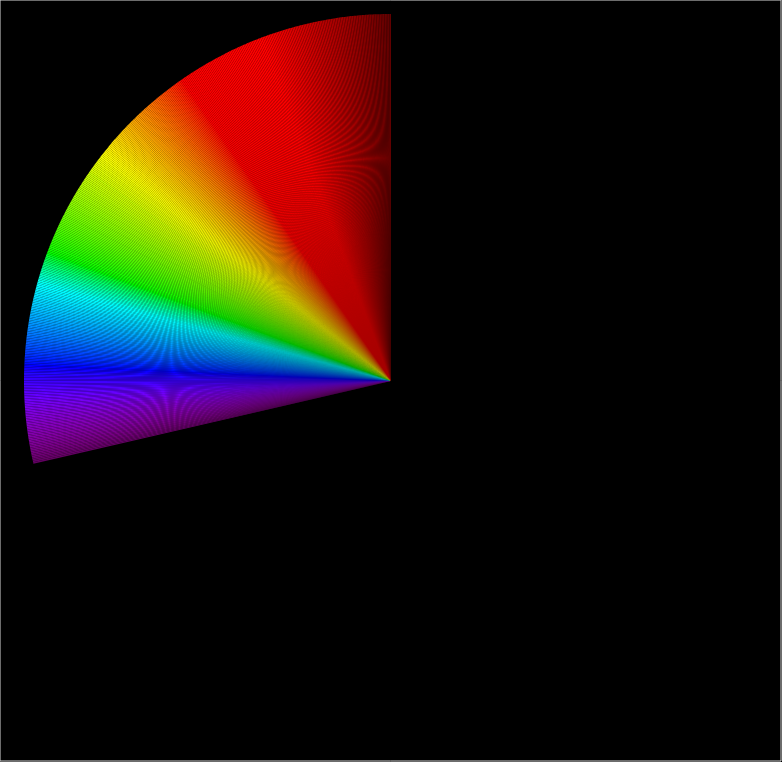
| Category | Series 0 |
|---|---|
| 0 | 1000 |
| 1 | 1 |
| 2 | 1 |
| 3 | 1 |
| 4 | 1 |
| 5 | 1 |
| 6 | 1 |
| 7 | 1 |
| 8 | 1 |
| 9 | 1 |
| 10 | 1 |
| 11 | 1 |
| 12 | 1 |
| 13 | 1 |
| 14 | 1 |
| 15 | 1 |
| 16 | 1 |
| 17 | 1 |
| 18 | 1 |
| 19 | 1 |
| 20 | 1 |
| 21 | 1 |
| 22 | 1 |
| 23 | 1 |
| 24 | 1 |
| 25 | 1 |
| 26 | 1 |
| 27 | 1 |
| 28 | 1 |
| 29 | 1 |
| 30 | 1 |
| 31 | 1 |
| 32 | 1 |
| 33 | 1 |
| 34 | 1 |
| 35 | 1 |
| 36 | 1 |
| 37 | 1 |
| 38 | 1 |
| 39 | 1 |
| 40 | 1 |
| 41 | 1 |
| 42 | 1 |
| 43 | 1 |
| 44 | 1 |
| 45 | 1 |
| 46 | 1 |
| 47 | 1 |
| 48 | 1 |
| 49 | 1 |
| 50 | 1 |
| 51 | 1 |
| 52 | 1 |
| 53 | 1 |
| 54 | 1 |
| 55 | 1 |
| 56 | 1 |
| 57 | 1 |
| 58 | 1 |
| 59 | 1 |
| 60 | 1 |
| 61 | 1 |
| 62 | 1 |
| 63 | 1 |
| 64 | 1 |
| 65 | 1 |
| 66 | 1 |
| 67 | 1 |
| 68 | 1 |
| 69 | 1 |
| 70 | 1 |
| 71 | 1 |
| 72 | 1 |
| 73 | 1 |
| 74 | 1 |
| 75 | 1 |
| 76 | 1 |
| 77 | 1 |
| 78 | 1 |
| 79 | 1 |
| 80 | 1 |
| 81 | 1 |
| 82 | 1 |
| 83 | 1 |
| 84 | 1 |
| 85 | 1 |
| 86 | 1 |
| 87 | 1 |
| 88 | 1 |
| 89 | 1 |
| 90 | 1 |
| 91 | 1 |
| 92 | 1 |
| 93 | 1 |
| 94 | 1 |
| 95 | 1 |
| 96 | 1 |
| 97 | 1 |
| 98 | 1 |
| 99 | 1 |
| 100 | 1 |
| 101 | 1 |
| 102 | 1 |
| 103 | 1 |
| 104 | 1 |
| 105 | 1 |
| 106 | 1 |
| 107 | 1 |
| 108 | 1 |
| 109 | 1 |
| 110 | 1 |
| 111 | 1 |
| 112 | 1 |
| 113 | 1 |
| 114 | 1 |
| 115 | 1 |
| 116 | 1 |
| 117 | 1 |
| 118 | 1 |
| 119 | 1 |
| 120 | 1 |
| 121 | 1 |
| 122 | 1 |
| 123 | 1 |
| 124 | 1 |
| 125 | 1 |
| 126 | 1 |
| 127 | 1 |
| 128 | 1 |
| 129 | 1 |
| 130 | 1 |
| 131 | 1 |
| 132 | 1 |
| 133 | 1 |
| 134 | 1 |
| 135 | 1 |
| 136 | 1 |
| 137 | 1 |
| 138 | 1 |
| 139 | 1 |
| 140 | 1 |
| 141 | 1 |
| 142 | 1 |
| 143 | 1 |
| 144 | 1 |
| 145 | 1 |
| 146 | 1 |
| 147 | 1 |
| 148 | 1 |
| 149 | 1 |
| 150 | 1 |
| 151 | 1 |
| 152 | 1 |
| 153 | 1 |
| 154 | 1 |
| 155 | 1 |
| 156 | 1 |
| 157 | 1 |
| 158 | 1 |
| 159 | 1 |
| 160 | 1 |
| 161 | 1 |
| 162 | 1 |
| 163 | 1 |
| 164 | 1 |
| 165 | 1 |
| 166 | 1 |
| 167 | 1 |
| 168 | 1 |
| 169 | 1 |
| 170 | 1 |
| 171 | 1 |
| 172 | 1 |
| 173 | 1 |
| 174 | 1 |
| 175 | 1 |
| 176 | 1 |
| 177 | 1 |
| 178 | 1 |
| 179 | 1 |
| 180 | 1 |
| 181 | 1 |
| 182 | 1 |
| 183 | 1 |
| 184 | 1 |
| 185 | 1 |
| 186 | 1 |
| 187 | 1 |
| 188 | 1 |
| 189 | 1 |
| 190 | 1 |
| 191 | 1 |
| 192 | 1 |
| 193 | 1 |
| 194 | 1 |
| 195 | 1 |
| 196 | 1 |
| 197 | 1 |
| 198 | 1 |
| 199 | 1 |
| 200 | 1 |
| 201 | 1 |
| 202 | 1 |
| 203 | 1 |
| 204 | 1 |
| 205 | 1 |
| 206 | 1 |
| 207 | 1 |
| 208 | 1 |
| 209 | 1 |
| 210 | 1 |
| 211 | 1 |
| 212 | 1 |
| 213 | 1 |
| 214 | 1 |
| 215 | 1 |
| 216 | 1 |
| 217 | 1 |
| 218 | 1 |
| 219 | 1 |
| 220 | 1 |
| 221 | 1 |
| 222 | 1 |
| 223 | 1 |
| 224 | 1 |
| 225 | 1 |
| 226 | 1 |
| 227 | 1 |
| 228 | 1 |
| 229 | 1 |
| 230 | 1 |
| 231 | 1 |
| 232 | 1 |
| 233 | 1 |
| 234 | 1 |
| 235 | 1 |
| 236 | 1 |
| 237 | 1 |
| 238 | 1 |
| 239 | 1 |
| 240 | 1 |
| 241 | 1 |
| 242 | 1 |
| 243 | 1 |
| 244 | 1 |
| 245 | 1 |
| 246 | 1 |
| 247 | 1 |
| 248 | 1 |
| 249 | 1 |
| 250 | 1 |
| 251 | 1 |
| 252 | 1 |
| 253 | 1 |
| 254 | 1 |
| 255 | 1 |
| 256 | 1 |
| 257 | 1 |
| 258 | 1 |
| 259 | 1 |
| 260 | 1 |
| 261 | 1 |
| 262 | 1 |
| 263 | 1 |
| 264 | 1 |
| 265 | 1 |
| 266 | 1 |
| 267 | 1 |
| 268 | 1 |
| 269 | 1 |
| 270 | 1 |
| 271 | 1 |
| 272 | 1 |
| 273 | 1 |
| 274 | 1 |
| 275 | 1 |
| 276 | 1 |
| 277 | 1 |
| 278 | 1 |
| 279 | 1 |
| 280 | 1 |
| 281 | 1 |
| 282 | 1 |
| 283 | 1 |
| 284 | 1 |
| 285 | 1 |
| 286 | 1 |
| 287 | 1 |
| 288 | 1 |
| 289 | 1 |
| 290 | 1 |
| 291 | 1 |
| 292 | 1 |
| 293 | 1 |
| 294 | 1 |
| 295 | 1 |
| 296 | 1 |
| 297 | 1 |
| 298 | 1 |
| 299 | 1 |
| 300 | 1 |
| 301 | 1 |
| 302 | 1 |
| 303 | 1 |
| 304 | 1 |
| 305 | 1 |
| 306 | 1 |
| 307 | 1 |
| 308 | 1 |
| 309 | 1 |
| 310 | 1 |
| 311 | 1 |
| 312 | 1 |
| 313 | 1 |
| 314 | 1 |
| 315 | 1 |
| 316 | 1 |
| 317 | 1 |
| 318 | 1 |
| 319 | 1 |
| 320 | 1 |
| 321 | 1 |
| 322 | 1 |
| 323 | 1 |
| 324 | 1 |
| 325 | 1 |
| 326 | 1 |
| 327 | 1 |
| 328 | 1 |
| 329 | 1 |
| 330 | 1 |
| 331 | 1 |
| 332 | 1 |
| 333 | 1 |
| 334 | 1 |
| 335 | 1 |
| 336 | 1 |
| 337 | 1 |
| 338 | 1 |
| 339 | 1 |
| 340 | 1 |
| 341 | 1 |
| 342 | 1 |
| 343 | 1 |
| 344 | 1 |
| 345 | 1 |
| 346 | 1 |
| 347 | 1 |
| 348 | 1 |
| 349 | 1 |
| 350 | 1 |
| 351 | 1 |
| 352 | 1 |
| 353 | 1 |
| 354 | 1 |
| 355 | 1 |
| 356 | 1 |
| 357 | 1 |
| 358 | 1 |
| 359 | 1 |
| 360 | 1 |
| 361 | 1 |
| 362 | 1 |
| 363 | 1 |
| 364 | 1 |
| 365 | 1 |
| 366 | 1 |
| 367 | 1 |
| 368 | 1 |
| 369 | 1 |
| 370 | 1 |
| 371 | 1 |
| 372 | 1 |
| 373 | 1 |
| 374 | 1 |
| 375 | 1 |
| 376 | 1 |
| 377 | 1 |
| 378 | 1 |
| 379 | 1 |
| 380 | 1 |
| 381 | 1 |
| 382 | 1 |
| 383 | 1 |
| 384 | 1 |
| 385 | 1 |
| 386 | 1 |
| 387 | 1 |
| 388 | 1 |
| 389 | 1 |
| 390 | 1 |
| 391 | 1 |
| 392 | 1 |
| 393 | 1 |
| 394 | 1 |
| 395 | 1 |
| 396 | 1 |
| 397 | 1 |
| 398 | 1 |
| 399 | 1 |
| 400 | 1 |
| 401 | 1 |